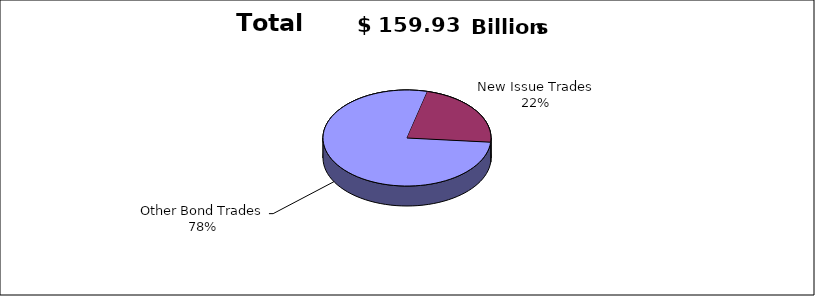
| Category | Series 0 |
|---|---|
| Other Bond Trades | 123984196887 |
| New Issue Trades | 35941958086 |